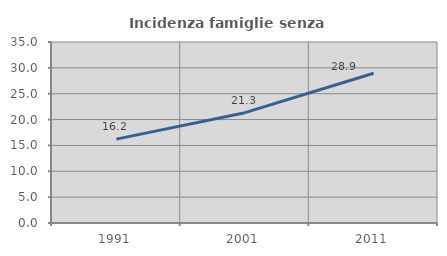
| Category | Incidenza famiglie senza nuclei |
|---|---|
| 1991.0 | 16.216 |
| 2001.0 | 21.333 |
| 2011.0 | 28.949 |